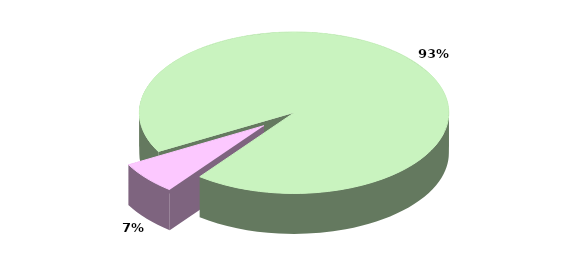
| Category | Series 0 |
|---|---|
| TOTALE ENTRATE CORRENTI | 23924.051 |
| TOTALE ENTRATE IN CONTO CAPITALE | 1668.357 |